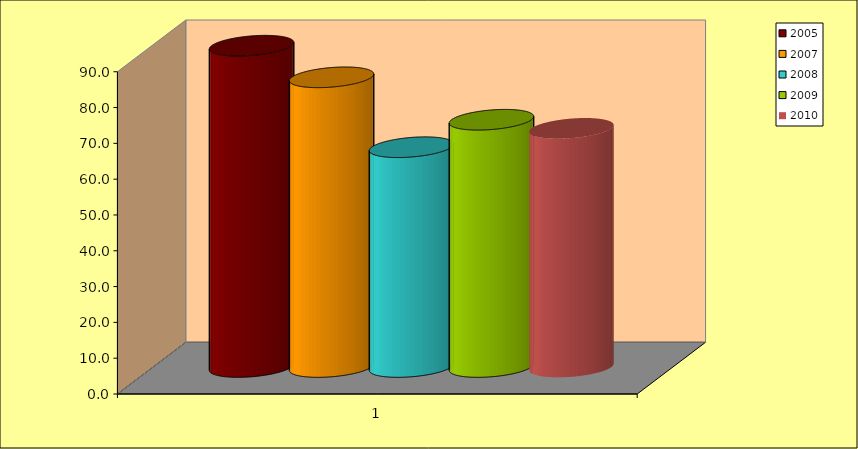
| Category | 2005 | 2007 | 2008 | 2009 | 2010 |
|---|---|---|---|---|---|
| 0 | 89.728 | 80.905 | 61.381 | 69.05 | 66.65 |